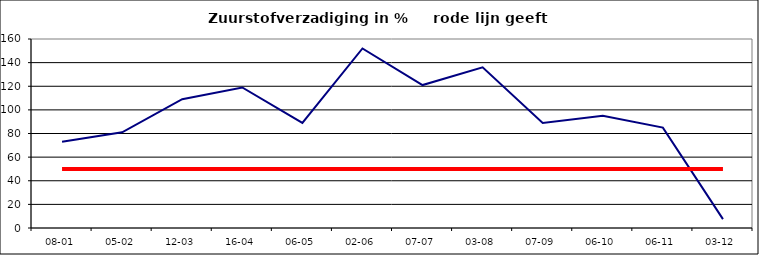
| Category | Series 0 | Series 1 |
|---|---|---|
| 08-01 | 73 | 50 |
| 05-02 | 81 | 50 |
| 12-03 | 109 | 50 |
| 16-04 | 119 | 50 |
| 06-05 | 89 | 50 |
| 02-06 | 152 | 50 |
| 07-07 | 121 | 50 |
| 03-08 | 136 | 50 |
| 07-09 | 89 | 50 |
| 06-10 | 95 | 50 |
| 06-11 | 85 | 50 |
| 03-12 | 7.5 | 50 |